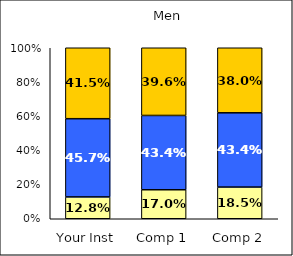
| Category | Low Pluralistic Orientation | Average Pluralistic Orientation | High Pluralistic Orientation |
|---|---|---|---|
| Your Inst | 0.128 | 0.457 | 0.415 |
| Comp 1 | 0.17 | 0.434 | 0.396 |
| Comp 2 | 0.185 | 0.434 | 0.38 |